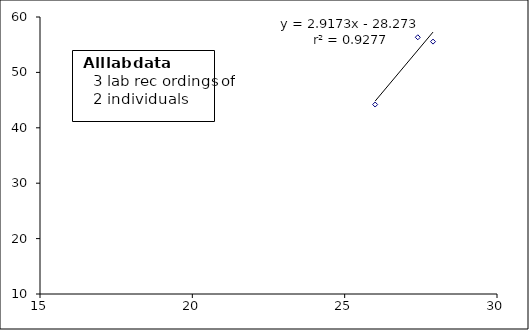
| Category | Series 0 |
|---|---|
| 26.0 | 44.2 |
| 27.4 | 56.338 |
| 27.9 | 55.556 |